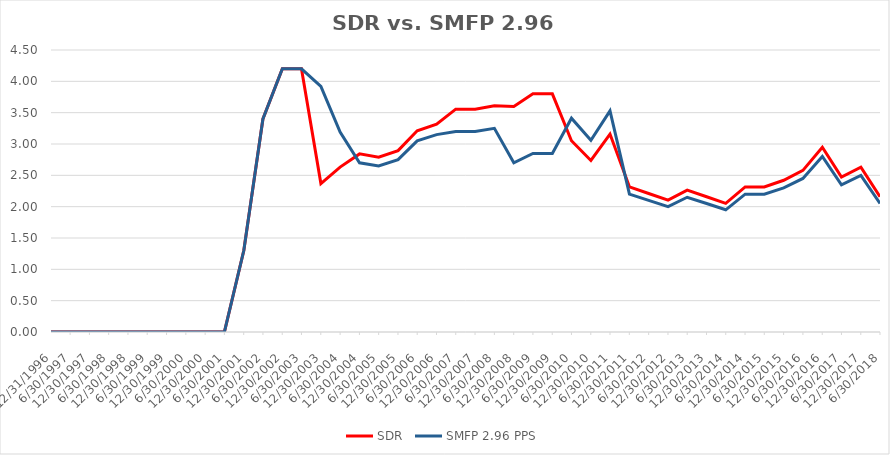
| Category | SDR | SMFP 2.96 PPS |
|---|---|---|
| 12/31/96 | 0 | 0 |
| 6/30/97 | 0 | 0 |
| 12/31/97 | 0 | 0 |
| 6/30/98 | 0 | 0 |
| 12/31/98 | 0 | 0 |
| 6/30/99 | 0 | 0 |
| 12/31/99 | 0 | 0 |
| 6/30/00 | 0 | 0 |
| 12/31/00 | 0 | 0 |
| 6/30/01 | 0 | 0 |
| 12/31/01 | 1.3 | 1.3 |
| 6/30/02 | 3.4 | 3.4 |
| 12/31/02 | 4.2 | 4.2 |
| 6/30/03 | 4.2 | 4.2 |
| 12/31/03 | 2.368 | 3.918 |
| 6/30/04 | 2.632 | 3.19 |
| 12/31/04 | 2.842 | 2.7 |
| 6/30/05 | 2.789 | 2.65 |
| 12/31/05 | 2.895 | 2.75 |
| 6/30/06 | 3.211 | 3.05 |
| 12/31/06 | 3.316 | 3.15 |
| 6/30/07 | 3.556 | 3.2 |
| 12/31/07 | 3.556 | 3.2 |
| 6/30/08 | 3.611 | 3.25 |
| 12/31/08 | 3.6 | 2.7 |
| 6/30/09 | 3.8 | 2.85 |
| 12/31/09 | 3.8 | 2.85 |
| 6/30/10 | 3.053 | 3.412 |
| 12/31/10 | 2.737 | 3.059 |
| 6/30/11 | 3.158 | 3.529 |
| 12/31/11 | 2.316 | 2.2 |
| 6/30/12 | 2.211 | 2.1 |
| 12/31/12 | 2.105 | 2 |
| 6/30/13 | 2.263 | 2.15 |
| 12/31/13 | 2.158 | 2.05 |
| 6/30/14 | 2.053 | 1.95 |
| 12/31/14 | 2.316 | 2.2 |
| 6/30/15 | 2.316 | 2.2 |
| 12/31/15 | 2.421 | 2.3 |
| 6/30/16 | 2.579 | 2.45 |
| 12/31/16 | 2.947 | 2.8 |
| 6/30/17 | 2.474 | 2.35 |
| 12/31/17 | 2.632 | 2.5 |
| 6/30/18 | 2.158 | 2.05 |